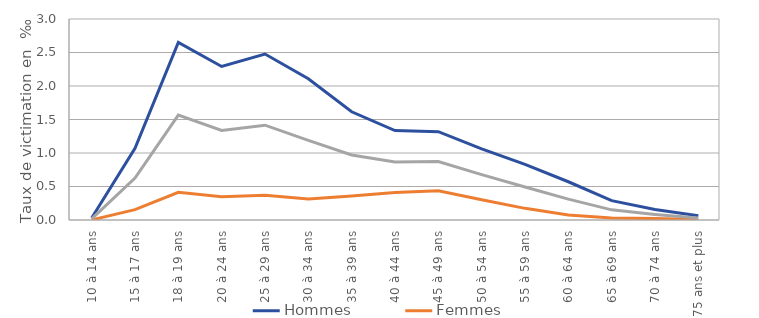
| Category | Hommes | Femmes | Ensemble |
|---|---|---|---|
| 10 à 14 ans | 0.03 | 0.002 | 0.016 |
| 15 à 17 ans | 1.07 | 0.155 | 0.625 |
| 18 à 19 ans | 2.651 | 0.414 | 1.565 |
| 20 à 24 ans | 2.291 | 0.348 | 1.336 |
| 25 à 29 ans | 2.477 | 0.37 | 1.415 |
| 30 à 34 ans | 2.108 | 0.315 | 1.189 |
| 35 à 39 ans | 1.615 | 0.36 | 0.971 |
| 40 à 44 ans | 1.335 | 0.409 | 0.864 |
| 45 à 49 ans | 1.319 | 0.437 | 0.874 |
| 50 à 54 ans | 1.061 | 0.304 | 0.677 |
| 55 à 59 ans | 0.83 | 0.174 | 0.493 |
| 60 à 64 ans | 0.571 | 0.075 | 0.312 |
| 65 à 69 ans | 0.289 | 0.03 | 0.152 |
| 70 à 74 ans | 0.157 | 0.021 | 0.084 |
| 75 ans et plus | 0.065 | 0.007 | 0.029 |